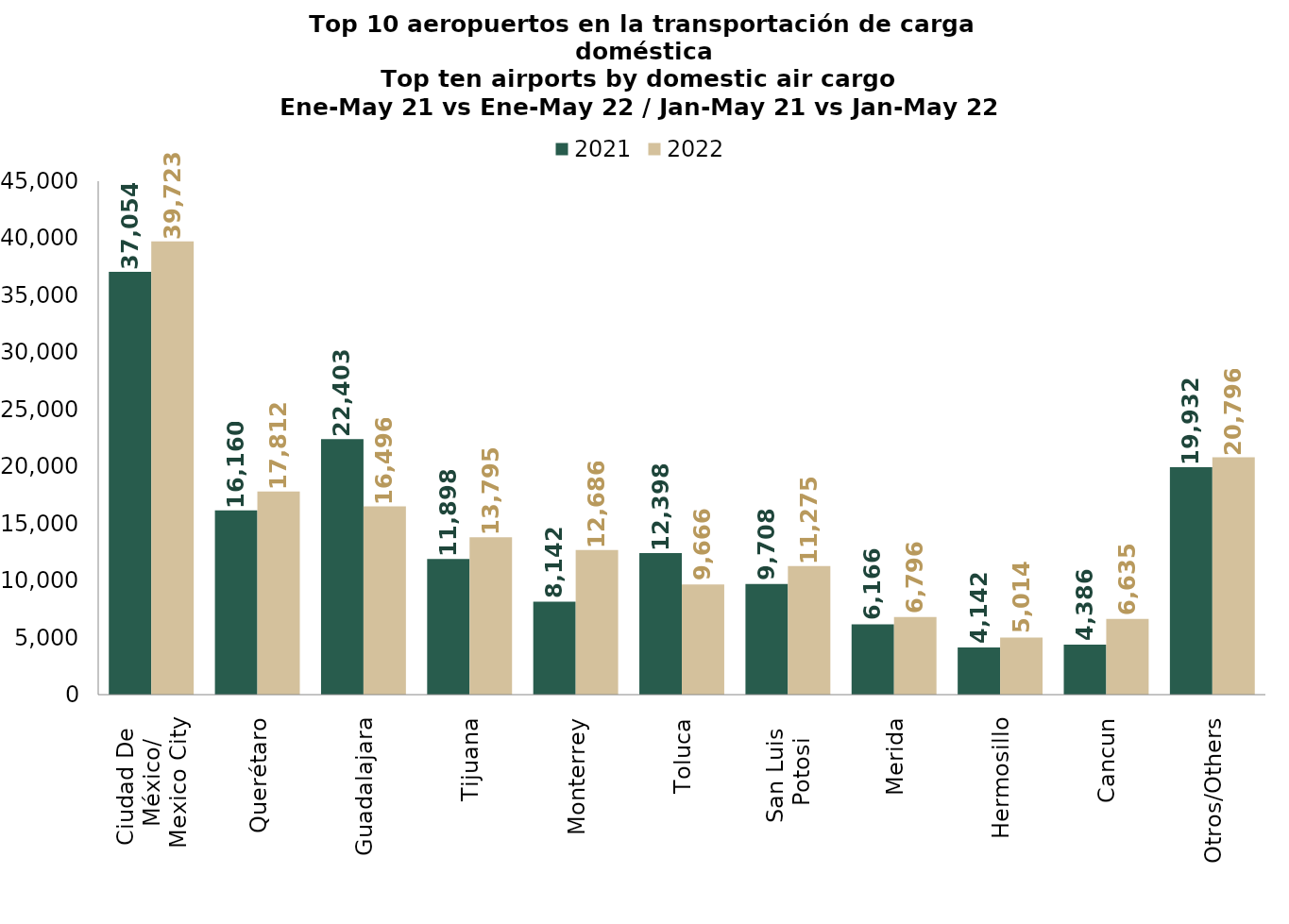
| Category | 2021 | 2022 |
|---|---|---|
| Ciudad De 
México/
Mexico City | 37053.61 | 39723.034 |
| Querétaro | 16160.178 | 17812.191 |
| Guadalajara | 22403.292 | 16495.551 |
| Tijuana | 11897.673 | 13794.896 |
| Monterrey | 8142.477 | 12685.5 |
| Toluca | 12398.252 | 9665.713 |
| San Luis 
Potosi | 9707.807 | 11274.85 |
| Merida | 6166.29 | 6795.588 |
| Hermosillo | 4141.541 | 5013.833 |
| Cancun | 4385.613 | 6634.613 |
| Otros/Others | 19932.486 | 20796.385 |